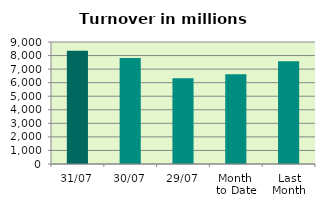
| Category | Series 0 |
|---|---|
| 31/07 | 8350.438 |
| 30/07 | 7811.095 |
| 29/07 | 6334.006 |
| Month 
to Date | 6625.077 |
| Last
Month | 7579.876 |